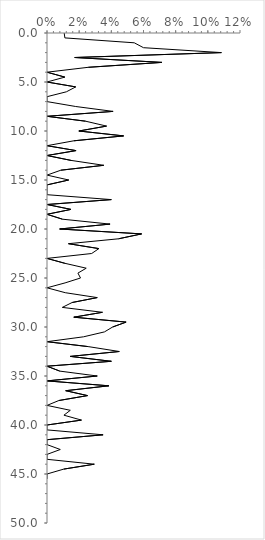
| Category | Series 0 |
|---|---|
| 0.0106951871657754 | 0 |
| 0.011111111111111112 | 0.5 |
| 0.05426356589147287 | 1 |
| 0.06 | 1.5 |
| 0.10843373493975904 | 2 |
| 0.017241379310344827 | 2.5 |
| 0.07142857142857142 | 3 |
| 0.02564102564102564 | 3.5 |
| 0.0 | 4 |
| 0.011111111111111112 | 4.5 |
| 0.0 | 5 |
| 0.017857142857142856 | 5.5 |
| 0.012048192771084338 | 6 |
| 0.0 | 6.5 |
| 0.0 | 7 |
| 0.017857142857142856 | 7.5 |
| 0.0410958904109589 | 8 |
| 0.0 | 8.5 |
| 0.024 | 9 |
| 0.037037037037037035 | 9.5 |
| 0.019801980198019802 | 10 |
| 0.047619047619047616 | 10.5 |
| 0.016666666666666666 | 11 |
| 0.0 | 11.5 |
| 0.018072289156626505 | 12 |
| 0.0 | 12.5 |
| 0.014925373134328358 | 13 |
| 0.03529411764705882 | 13.5 |
| 0.008620689655172414 | 14 |
| 0.0 | 14.5 |
| 0.013513513513513514 | 15 |
| 0.0 | 15.5 |
| 0.0 | 16 |
| 0.0 | 16.5 |
| 0.04 | 17 |
| 0.0 | 17.5 |
| 0.014925373134328358 | 18 |
| 0.0 | 18.5 |
| 0.009615384615384616 | 19 |
| 0.0392156862745098 | 19.5 |
| 0.007874015748031496 | 20 |
| 0.058823529411764705 | 20.5 |
| 0.044444444444444446 | 21 |
| 0.013333333333333334 | 21.5 |
| 0.03225806451612903 | 22 |
| 0.027777777777777776 | 22.5 |
| 0.0 | 23 |
| 0.011111111111111112 | 23.5 |
| 0.024390243902439025 | 24 |
| 0.019230769230769232 | 24.5 |
| 0.020833333333333332 | 25 |
| 0.011235955056179775 | 25.5 |
| 0.0 | 26 |
| 0.011363636363636364 | 26.5 |
| 0.03125 | 27 |
| 0.015625 | 27.5 |
| 0.009523809523809525 | 28 |
| 0.034482758620689655 | 28.5 |
| 0.016666666666666666 | 29 |
| 0.04918032786885246 | 29.5 |
| 0.04081632653061224 | 30 |
| 0.03571428571428571 | 30.5 |
| 0.022727272727272728 | 31 |
| 0.0 | 31.5 |
| 0.02564102564102564 | 32 |
| 0.0449438202247191 | 32.5 |
| 0.014492753623188406 | 33 |
| 0.04 | 33.5 |
| 0.0 | 34 |
| 0.007936507936507936 | 34.5 |
| 0.03125 | 35 |
| 0.0 | 35.5 |
| 0.038461538461538464 | 36 |
| 0.011627906976744186 | 36.5 |
| 0.025210084033613446 | 37 |
| 0.007407407407407408 | 37.5 |
| 0.0 | 38 |
| 0.014492753623188406 | 38.5 |
| 0.010526315789473684 | 39 |
| 0.02142857142857143 | 39.5 |
| 0.0 | 40 |
| 0.0 | 40.5 |
| 0.03488372093023256 | 41 |
| 0.0 | 41.5 |
| 0.0 | 42 |
| 0.008264462809917356 | 42.5 |
| 0.0 | 43 |
| 0.0 | 43.5 |
| 0.029411764705882353 | 44 |
| 0.010416666666666666 | 44.5 |
| 0.0 | 45 |
| 0.0 | 45.5 |